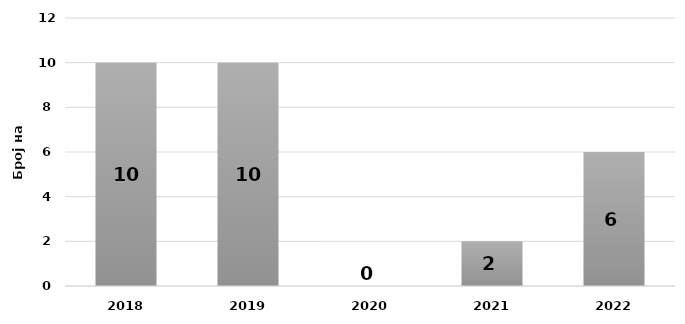
| Category | Одржани обуки на претставници од општините |
|---|---|
| 2018.0 | 10 |
| 2019.0 | 10 |
| 2020.0 | 0 |
| 2021.0 | 2 |
| 2022.0 | 6 |